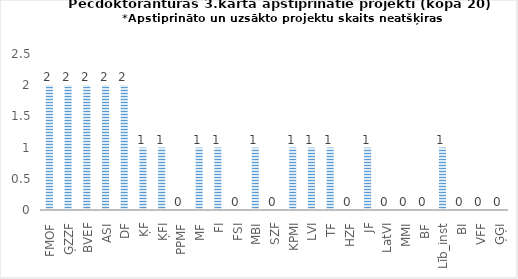
| Category | Series 0 |
|---|---|
| FMOF | 2 |
| ĢZZF | 2 |
| BVEF | 2 |
| ASI | 2 |
| DF | 2 |
| ĶF | 1 |
| ĶFI | 1 |
| PPMF | 0 |
| MF | 1 |
| FI | 1 |
| FSI | 0 |
| MBI | 1 |
| SZF | 0 |
| KPMI | 1 |
| LVI | 1 |
| TF | 1 |
| HZF | 0 |
| JF | 1 |
| LatVI | 0 |
| MMI | 0 |
| BF | 0 |
| Līb_inst | 1 |
| BI | 0 |
| VFF | 0 |
| ĢĢI | 0 |